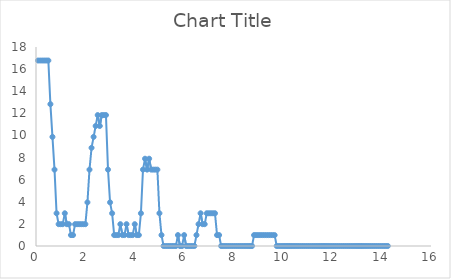
| Category | Series 0 |
|---|---|
| 0.08333333333333333 | 16.776 |
| 0.16666666666666666 | 16.776 |
| 0.25 | 16.776 |
| 0.3333333333333333 | 16.776 |
| 0.4166666666666667 | 16.776 |
| 0.5 | 16.776 |
| 0.5833333333333334 | 12.829 |
| 0.6666666666666666 | 9.868 |
| 0.75 | 6.908 |
| 0.8333333333333334 | 2.961 |
| 0.9166666666666666 | 1.974 |
| 1.0 | 1.974 |
| 1.0833333333333333 | 1.974 |
| 1.1666666666666667 | 2.961 |
| 1.25 | 1.974 |
| 1.3333333333333333 | 1.974 |
| 1.4166666666666667 | 0.987 |
| 1.5 | 0.987 |
| 1.5833333333333333 | 1.974 |
| 1.6666666666666667 | 1.974 |
| 1.75 | 1.974 |
| 1.8333333333333333 | 1.974 |
| 1.9166666666666667 | 1.974 |
| 2.0 | 1.974 |
| 2.0833333333333335 | 3.947 |
| 2.1666666666666665 | 6.908 |
| 2.25 | 8.882 |
| 2.3333333333333335 | 9.868 |
| 2.4166666666666665 | 10.855 |
| 2.5 | 11.842 |
| 2.5833333333333335 | 10.855 |
| 2.6666666666666665 | 11.842 |
| 2.75 | 11.842 |
| 2.8333333333333335 | 11.842 |
| 2.9166666666666665 | 6.908 |
| 3.0 | 3.947 |
| 3.0833333333333335 | 2.961 |
| 3.1666666666666665 | 0.987 |
| 3.25 | 0.987 |
| 3.3333333333333335 | 0.987 |
| 3.4166666666666665 | 1.974 |
| 3.5 | 0.987 |
| 3.5833333333333335 | 0.987 |
| 3.6666666666666665 | 1.974 |
| 3.75 | 0.987 |
| 3.8333333333333335 | 0.987 |
| 3.9166666666666665 | 0.987 |
| 4.0 | 1.974 |
| 4.083333333333333 | 0.987 |
| 4.166666666666667 | 0.987 |
| 4.25 | 2.961 |
| 4.333333333333333 | 6.908 |
| 4.416666666666667 | 7.895 |
| 4.5 | 6.908 |
| 4.583333333333333 | 7.895 |
| 4.666666666666667 | 6.908 |
| 4.75 | 6.908 |
| 4.833333333333333 | 6.908 |
| 4.916666666666667 | 6.908 |
| 5.0 | 2.961 |
| 5.083333333333333 | 0.987 |
| 5.166666666666667 | 0 |
| 5.25 | 0 |
| 5.333333333333333 | 0 |
| 5.416666666666667 | 0 |
| 5.5 | 0 |
| 5.583333333333333 | 0 |
| 5.666666666666667 | 0 |
| 5.75 | 0.987 |
| 5.833333333333333 | 0 |
| 5.916666666666667 | 0 |
| 6.0 | 0.987 |
| 6.083333333333333 | 0 |
| 6.166666666666667 | 0 |
| 6.25 | 0 |
| 6.333333333333333 | 0 |
| 6.416666666666667 | 0 |
| 6.5 | 0.987 |
| 6.583333333333333 | 1.974 |
| 6.666666666666667 | 2.961 |
| 6.75 | 1.974 |
| 6.833333333333333 | 1.974 |
| 6.916666666666667 | 2.961 |
| 7.0 | 2.961 |
| 7.083333333333333 | 2.961 |
| 7.166666666666667 | 2.961 |
| 7.25 | 2.961 |
| 7.333333333333333 | 0.987 |
| 7.416666666666667 | 0.987 |
| 7.5 | 0 |
| 7.583333333333333 | 0 |
| 7.666666666666667 | 0 |
| 7.75 | 0 |
| 7.833333333333333 | 0 |
| 7.916666666666667 | 0 |
| 8.0 | 0 |
| 8.083333333333334 | 0 |
| 8.166666666666666 | 0 |
| 8.25 | 0 |
| 8.333333333333334 | 0 |
| 8.416666666666666 | 0 |
| 8.5 | 0 |
| 8.583333333333334 | 0 |
| 8.666666666666666 | 0 |
| 8.75 | 0 |
| 8.833333333333334 | 0.987 |
| 8.916666666666666 | 0.987 |
| 9.0 | 0.987 |
| 9.083333333333334 | 0.987 |
| 9.166666666666666 | 0.987 |
| 9.25 | 0.987 |
| 9.333333333333334 | 0.987 |
| 9.416666666666666 | 0.987 |
| 9.5 | 0.987 |
| 9.583333333333334 | 0.987 |
| 9.666666666666666 | 0.987 |
| 9.75 | 0 |
| 9.833333333333334 | 0 |
| 9.916666666666666 | 0 |
| 10.0 | 0 |
| 10.083333333333334 | 0 |
| 10.166666666666666 | 0 |
| 10.25 | 0 |
| 10.333333333333334 | 0 |
| 10.416666666666666 | 0 |
| 10.5 | 0 |
| 10.583333333333334 | 0 |
| 10.666666666666666 | 0 |
| 10.75 | 0 |
| 10.833333333333334 | 0 |
| 10.916666666666666 | 0 |
| 11.0 | 0 |
| 11.083333333333334 | 0 |
| 11.166666666666666 | 0 |
| 11.25 | 0 |
| 11.333333333333334 | 0 |
| 11.416666666666666 | 0 |
| 11.5 | 0 |
| 11.583333333333334 | 0 |
| 11.666666666666666 | 0 |
| 11.75 | 0 |
| 11.833333333333334 | 0 |
| 11.916666666666666 | 0 |
| 12.0 | 0 |
| 12.083333333333334 | 0 |
| 12.166666666666666 | 0 |
| 12.25 | 0 |
| 12.333333333333334 | 0 |
| 12.416666666666666 | 0 |
| 12.5 | 0 |
| 12.583333333333334 | 0 |
| 12.666666666666666 | 0 |
| 12.75 | 0 |
| 12.833333333333334 | 0 |
| 12.916666666666666 | 0 |
| 13.0 | 0 |
| 13.083333333333334 | 0 |
| 13.166666666666666 | 0 |
| 13.25 | 0 |
| 13.333333333333334 | 0 |
| 13.416666666666666 | 0 |
| 13.5 | 0 |
| 13.583333333333334 | 0 |
| 13.666666666666666 | 0 |
| 13.75 | 0 |
| 13.833333333333334 | 0 |
| 13.916666666666666 | 0 |
| 14.0 | 0 |
| 14.083333333333334 | 0 |
| 14.166666666666666 | 0 |
| 14.25 | 0 |